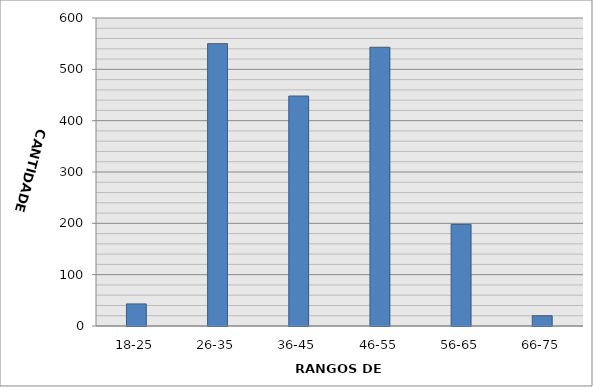
| Category | Series 0 |
|---|---|
| 18-25 | 43 |
| 26-35 | 550 |
| 36-45 | 448 |
| 46-55 | 543 |
| 56-65 | 198 |
| 66-75 | 20 |